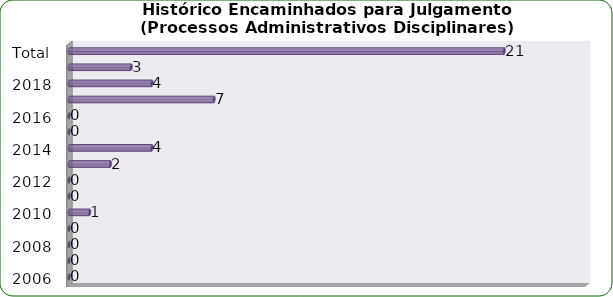
| Category | Total de Processos Administrativos Disciplinares |
|---|---|
| 2006 | 0 |
| 2007 | 0 |
| 2008 | 0 |
| 2009 | 0 |
| 2010 | 1 |
| 2011 | 0 |
| 2012 | 0 |
| 2013 | 2 |
| 2014 | 4 |
| 2015 | 0 |
| 2016 | 0 |
| 2017 | 7 |
| 2018 | 4 |
| 2019 | 3 |
| Total | 21 |